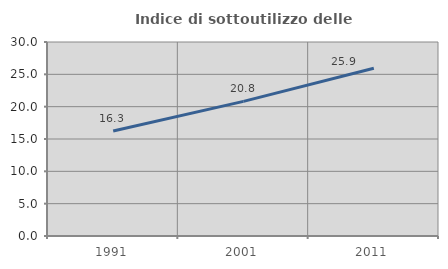
| Category | Indice di sottoutilizzo delle abitazioni  |
|---|---|
| 1991.0 | 16.25 |
| 2001.0 | 20.818 |
| 2011.0 | 25.941 |